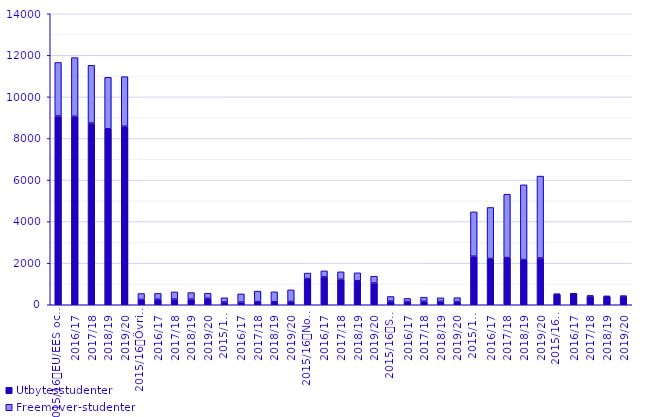
| Category | Utbytesstudenter | Freemover-studenter |
|---|---|---|
| 0 | 9080 | 2579 |
| 1 | 9068 | 2823 |
| 2 | 8740 | 2781 |
| 3 | 8466 | 2478 |
| 4 | 8589 | 2386 |
| 5 | 256 | 284 |
| 6 | 265 | 282 |
| 7 | 274 | 345 |
| 8 | 269 | 317 |
| 9 | 311 | 246 |
| 10 | 135 | 201 |
| 11 | 128 | 395 |
| 12 | 151 | 505 |
| 13 | 148 | 475 |
| 14 | 160 | 556 |
| 15 | 1260 | 263 |
| 16 | 1341 | 288 |
| 17 | 1221 | 364 |
| 18 | 1156 | 380 |
| 19 | 1048 | 326 |
| 20 | 178 | 220 |
| 21 | 154 | 150 |
| 22 | 168 | 196 |
| 23 | 163 | 171 |
| 24 | 156 | 185 |
| 25 | 2336 | 2133 |
| 26 | 2227 | 2455 |
| 27 | 2267 | 3051 |
| 28 | 2174 | 3596 |
| 29 | 2251 | 3940 |
| 30 | 497 | 28 |
| 31 | 528 | 26 |
| 32 | 416 | 23 |
| 33 | 394 | 29 |
| 34 | 406 | 24 |